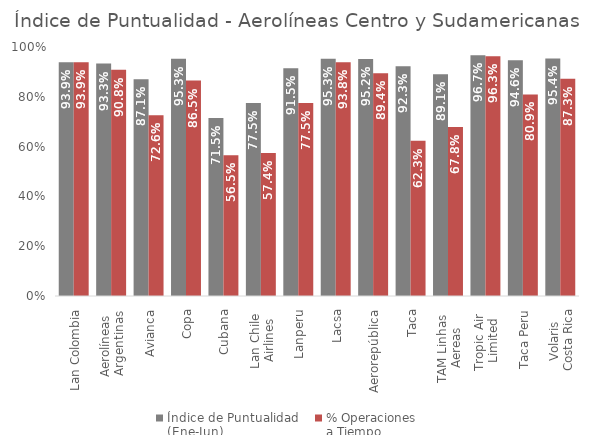
| Category | Índice de Puntualidad
(Ene-Jun) | % Operaciones 
a Tiempo |
|---|---|---|
| Lan Colombia | 0.939 | 0.939 |
| Aerolíneas 
Argentinas | 0.933 | 0.908 |
| Avianca | 0.871 | 0.726 |
| Copa | 0.953 | 0.865 |
| Cubana | 0.715 | 0.565 |
| Lan Chile 
Airlines | 0.775 | 0.574 |
| Lanperu | 0.915 | 0.775 |
| Lacsa | 0.953 | 0.938 |
| Aerorepública | 0.952 | 0.894 |
| Taca | 0.923 | 0.623 |
| TAM Linhas 
Aereas | 0.891 | 0.678 |
| Tropic Air 
Limited | 0.967 | 0.963 |
| Taca Peru | 0.946 | 0.809 |
| Volaris 
Costa Rica | 0.954 | 0.873 |